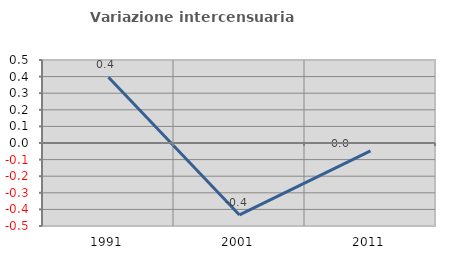
| Category | Variazione intercensuaria annua |
|---|---|
| 1991.0 | 0.396 |
| 2001.0 | -0.433 |
| 2011.0 | -0.048 |